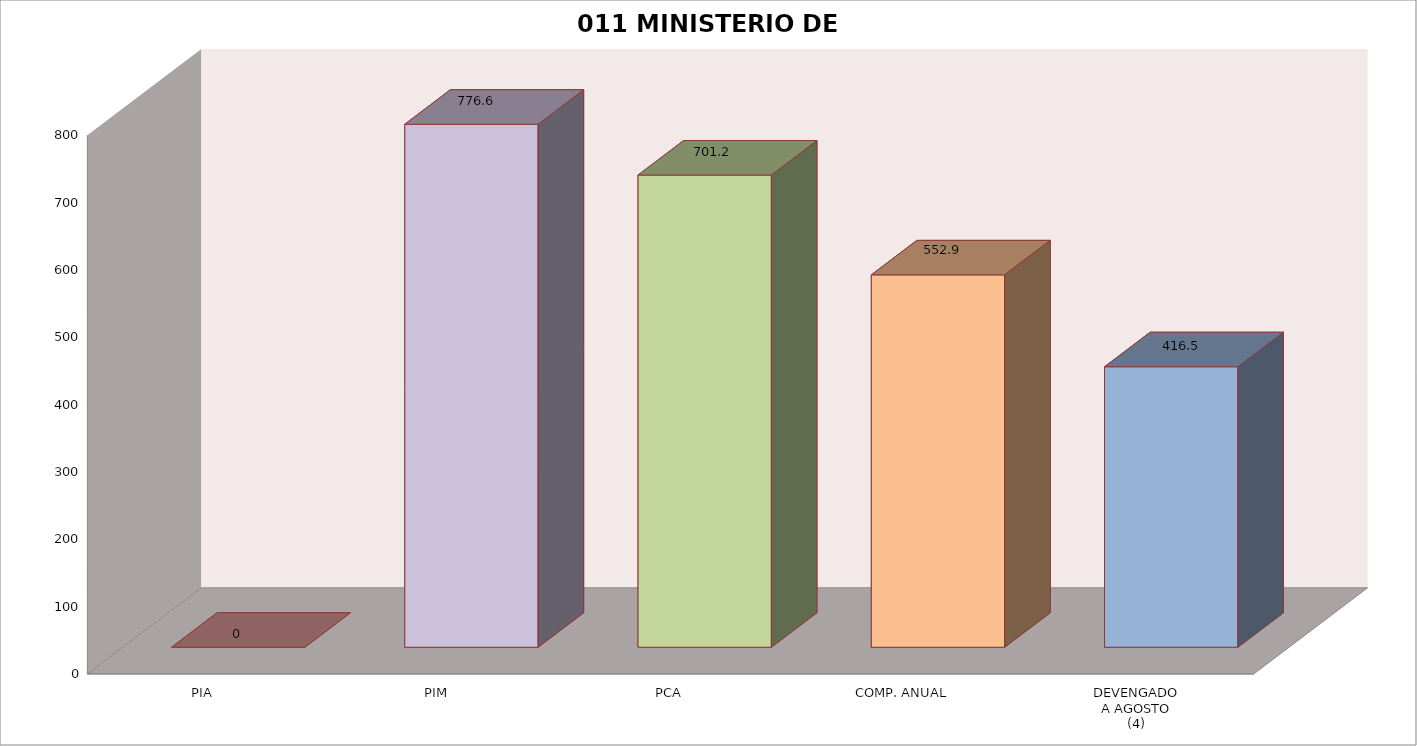
| Category | 011 MINISTERIO DE SALUD |
|---|---|
| PIA | 0 |
| PIM | 776.626 |
| PCA | 701.155 |
| COMP. ANUAL | 552.945 |
| DEVENGADO
A AGOSTO
(4) | 416.519 |